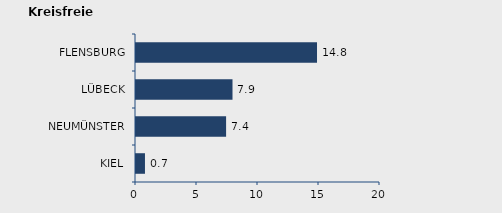
| Category | Wanderungssaldo |
|---|---|
| KIEL | 0.735 |
| NEUMÜNSTER | 7.385 |
| LÜBECK | 7.91 |
| FLENSBURG | 14.837 |